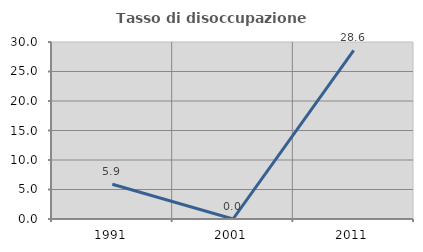
| Category | Tasso di disoccupazione giovanile  |
|---|---|
| 1991.0 | 5.882 |
| 2001.0 | 0 |
| 2011.0 | 28.571 |